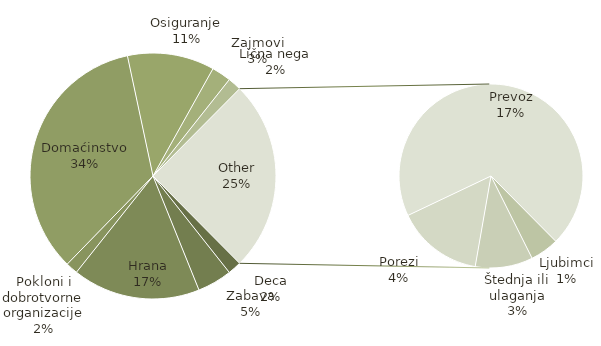
| Category | Zbir |
|---|---|
| Deca | 140 |
| Zabava | 358 |
| Hrana | 1320 |
| Pokloni i dobrotvorne organizacije | 125 |
| Domaćinstvo | 2702 |
| Osiguranje | 900 |
| Zajmovi | 200 |
| Lična nega | 140 |
| Ljubimci | 100 |
| Štednja ili ulaganja | 200 |
| Porezi | 300 |
| Prevoz | 1375 |